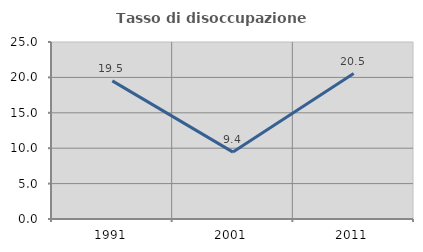
| Category | Tasso di disoccupazione giovanile  |
|---|---|
| 1991.0 | 19.509 |
| 2001.0 | 9.449 |
| 2011.0 | 20.548 |